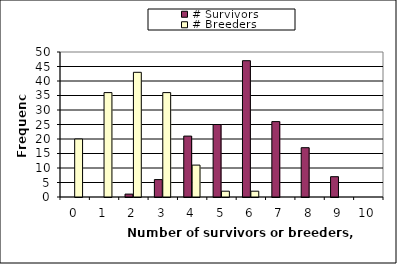
| Category | # Survivors | # Breeders |
|---|---|---|
| 0.0 | 0 | 20 |
| 1.0 | 0 | 36 |
| 2.0 | 1 | 43 |
| 3.0 | 6 | 36 |
| 4.0 | 21 | 11 |
| 5.0 | 25 | 2 |
| 6.0 | 47 | 2 |
| 7.0 | 26 | 0 |
| 8.0 | 17 | 0 |
| 9.0 | 7 | 0 |
| 10.0 | 0 | 0 |